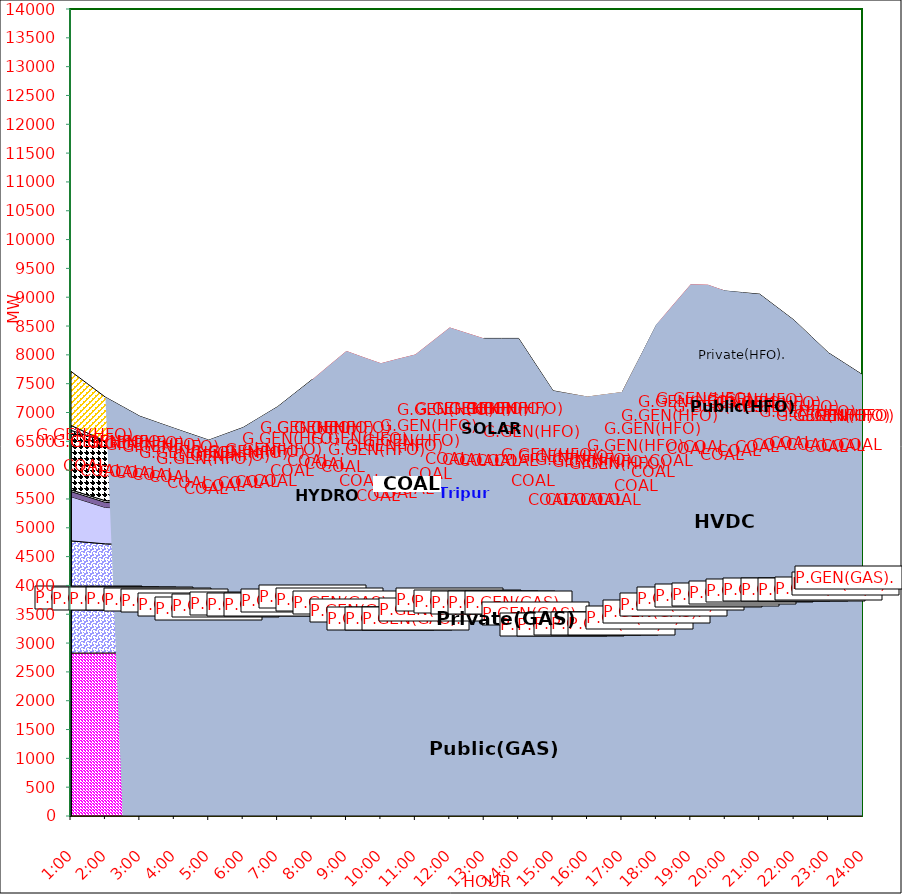
| Category | GAS | P.GEN(GAS). |  HVDC | TRIPURA | HYDRO | COAL | SOLAR | G.GEN(HFO) | P.GEN(HFO). | G.GEN(HSD) | P.GEN(HSD) | SHORTAGE | Total Energy Gen 189.718 MKWHr 
Energy Not Served   1.715 MKWHr 
Energy Requirement     191.433 MKWHr  |
|---|---|---|---|---|---|---|---|---|---|---|---|---|---|
| 1:00 | 2826 | 1947 | 767 | 88 | 30 | 1032 | 0 | 86 | 937 | 0 | 0 | 0 |  |
| 1:30 | 2827 | 1920 | 699 | 88 | 30 | 1032 | 0 | 43 | 850.5 | 0 | 0 | 0 |  |
| 2:00 | 2828 | 1893 | 631 | 88 | 30 | 1032 | 0 | 0 | 764 | 0 | 0 | 0 |  |
| 2:30 | 2829 | 1885 | 631 | 84 | 30 | 1032 | 0 | 0 | 609.5 | 0 | 0 | 0 |  |
| 3:00 | 2830 | 1877 | 631 | 80 | 30 | 1032 | 0 | 0 | 455 | 0 | 0 | 0 |  |
| 3:30 | 2830.5 | 1840.5 | 631 | 80 | 30 | 1032 | 0 | 0 | 386 | 0 | 0 | 0 |  |
| 4:00 | 2831 | 1804 | 631 | 80 | 30 | 1032 | 0 | 0 | 317 | 0 | 0 | 0 |  |
| 4:30 | 2801.5 | 1731.5 | 631 | 80 | 30 | 1032 | 0 | 0 | 317 | 0 | 0 | 0 |  |
| 5:00 | 2772 | 1659 | 631 | 80 | 30 | 1032 | 0 | 0 | 317 | 0 | 0 | 0 |  |
| 5:30 | 2807 | 1672.5 | 631 | 82 | 30 | 1032 | 0 | 0 | 376 | 0 | 0 | 0 |  |
| 6:00 | 2842 | 1686 | 631 | 84 | 30 | 1032 | 0 | 0 | 435 | 0 | 0 | 0 |  |
| 6:30 | 2806.5 | 1735.5 | 631.5 | 83 | 30 | 1032.5 | 1.5 | 16 | 583.5 | 0 | 0 | 0 |  |
| 7:00 | 2771 | 1785 | 632 | 82 | 30 | 1033 | 3 | 32 | 732 | 0 | 0 | 0 |  |
| 7:30 | 2828 | 1808 | 725.5 | 83 | 30 | 1033 | 26 | 32 | 769.5 | 0 | 0 | 0 |  |
| 8:00 | 2885 | 1831 | 819 | 84 | 30 | 1033 | 49 | 32 | 807 | 0 | 0 | 0 |  |
| 8:30 | 2839 | 1825.5 | 819 | 86 | 30 | 1034 | 85.5 | 42 | 861.5 | 0 | 0 | 195.835 |  |
| 9:00 | 2793 | 1820 | 819 | 88 | 30 | 1035 | 122 | 52 | 916 | 0 | 0 | 391.669 |  |
| 9:30 | 2698.5 | 1727.5 | 772 | 88 | 30 | 997.5 | 191 | 73.5 | 917.5 | 0.5 | 0 | 464.474 |  |
| 10:00 | 2604 | 1635 | 725 | 88 | 30 | 960 | 260 | 95 | 919 | 1 | 0 | 537.278 |  |
| 10:30 | 2595.5 | 1652.5 | 787 | 92 | 30 | 925.5 | 288.5 | 116.5 | 924.5 | 2.5 | 0 | 516.543 |  |
| 11:00 | 2587 | 1670 | 849 | 96 | 30 | 891 | 317 | 138 | 930 | 4 | 0 | 495.807 |  |
| 11:30 | 2658 | 1855.5 | 857.5 | 99 | 30 | 881 | 327.5 | 145 | 982.5 | 5.5 | 0 | 399.503 |  |
| 12:00 | 2729 | 2041 | 866 | 102 | 30 | 871 | 338 | 152 | 1035 | 7 | 0 | 303.198 |  |
| 12:30 | 2715 | 2025 | 865.5 | 107 | 30 | 880.5 | 334 | 208 | 1059.5 | 3.5 | 0 | 151.599 |  |
| 13:00 | 2701 | 2009 | 865 | 112 | 30 | 890 | 330 | 264 | 1084 | 0 | 0 | 0 |  |
| 13:30 | 2701 | 2009 | 865 | 112 | 30 | 890 | 330 | 264 | 1084 | 0 | 0 | 0 |  |
| 14:00 | 2701 | 2009 | 865 | 112 | 30 | 890 | 330 | 264 | 1084 | 0 | 0 | 0 |  |
| 14:30 | 2580.5 | 1859 | 818 | 102 | 30 | 869 | 261.5 | 303 | 1007.5 | 0 | 0 | 0 |  |
| 15:00 | 2460 | 1709 | 771 | 92 | 30 | 848 | 193 | 342 | 931 | 0 | 0 | 0 |  |
| 15:30 | 2470.5 | 1709.5 | 771 | 89 | 30 | 839 | 147 | 353 | 912.5 | 5.5 | 0 | 0 |  |
| 16:00 | 2481 | 1710 | 771 | 86 | 30 | 830 | 101 | 364 | 894 | 11 | 0 | 0 |  |
| 16:30 | 2486 | 1699 | 771 | 88 | 30 | 830 | 61 | 384 | 956.5 | 11 | 0 | 0 |  |
| 17:00 | 2491 | 1688 | 771 | 90 | 30 | 830 | 21 | 404 | 1019 | 11 | 0 | 0 |  |
| 17:30 | 2572 | 1742.5 | 841.5 | 94 | 30 | 895 | 10.5 | 467.5 | 1274.5 | 8 | 5.5 | 0 |  |
| 18:00 | 2653 | 1797 | 912 | 98 | 30 | 960 | 0 | 531 | 1530 | 5 | 11 | 0 |  |
| 18:30 | 2720 | 1884.5 | 912.5 | 103 | 30 | 1040.5 | 0 | 527 | 1618.5 | 2.5 | 9.5 | 29 |  |
| 19:00 | 2787 | 1972 | 913 | 108 | 30 | 1121 | 0 | 523 | 1707 | 0 | 8 | 58 |  |
| 19:30 | 2840 | 1960 | 913 | 108 | 30 | 1131 | 0 | 525 | 1674 | 0 | 5 | 29 |  |
| 20:00 | 2902 | 1878 | 771 | 102 | 30 | 1161 | 0 | 528 | 1735 | 0 | 4 | 0 |  |
| 20:30 | 2935.5 | 1885.5 | 795 | 105 | 30 | 1171 | 0 | 498 | 1660 | 0 | 2 | 0 |  |
| 21:00 | 2969 | 1893 | 819 | 108 | 30 | 1181 | 0 | 468 | 1585 | 0 | 0 | 0 |  |
| 21:30 | 2990 | 1861.5 | 865.5 | 107 | 30 | 1176 | 0 | 270 | 1527 | 0 | 0 | 0 |  |
| 22:00 | 3011 | 1830 | 912 | 106 | 30 | 1171 | 0 | 72 | 1469 | 0 | 0 | 0 |  |
| 22:30 | 3021 | 1827.5 | 912.5 | 100 | 30 | 1110.5 | 0 | 36 | 1280 | 0 | 0 | 0 |  |
| 23:00 | 3031 | 1825 | 913 | 94 | 30 | 1050 | 0 | 0 | 1091 | 0 | 0 | 0 |  |
| 23:30 | 3104.5 | 1867.5 | 819 | 91 | 30 | 1035.5 | 0 | 0 | 894.5 | 0 | 0 | 0 |  |
| 24:00 | 3178 | 1910 | 725 | 88 | 30 | 1021 | 0 | 0 | 698 | 0 | 0 | 0 |  |